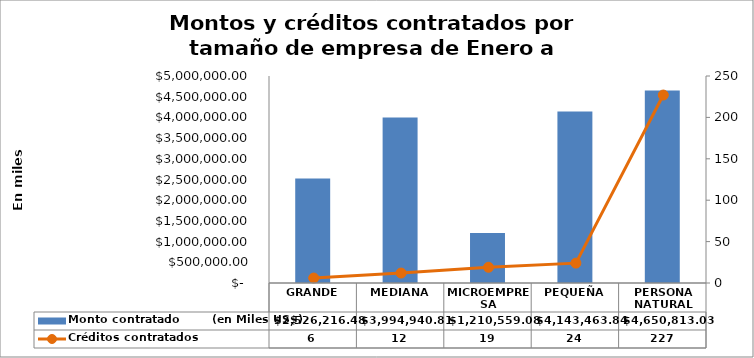
| Category | Monto contratado        (en Miles US$) |
|---|---|
| GRANDE | 2526216.48 |
| MEDIANA | 3994940.81 |
| MICROEMPRESA | 1210559.08 |
| PEQUEÑA | 4143463.84 |
| PERSONA NATURAL | 4650813.03 |